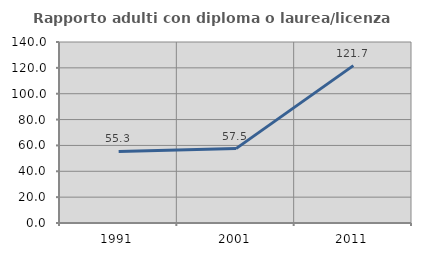
| Category | Rapporto adulti con diploma o laurea/licenza media  |
|---|---|
| 1991.0 | 55.319 |
| 2001.0 | 57.534 |
| 2011.0 | 121.739 |